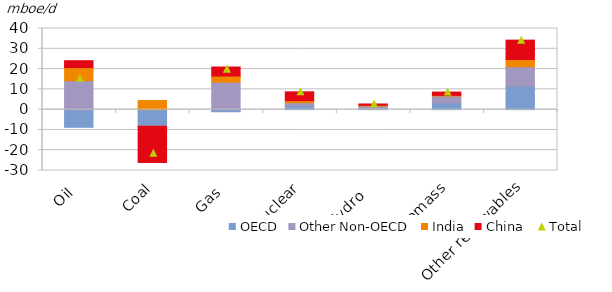
| Category | OECD | Other Non-OECD | India | China  |
|---|---|---|---|---|
| Oil | -8.708 | 14.27 | 6.464 | 3.393 |
| Coal | -7.947 | -0.219 | 4.489 | -17.86 |
| Gas | -1.056 | 13.51 | 3.066 | 4.446 |
| Nuclear | 1.799 | 1.62 | 1.016 | 4.342 |
| Hydro  | 0.433 | 1.368 | 0.34 | 0.644 |
| Biomass | 3.231 | 3.48 | 0.331 | 1.607 |
| Other renewables | 11.564 | 9.589 | 3.576 | 9.538 |